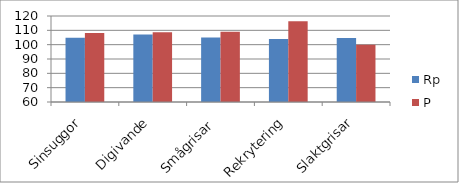
| Category | Rp | P |
|---|---|---|
| Sinsuggor | 104.839 | 108.108 |
| Digivande | 107.143 | 108.696 |
| Smågrisar  | 104.972 | 109.091 |
| Rekrytering | 104.027 | 116.279 |
| Slaktgrisar | 104.698 | 100 |